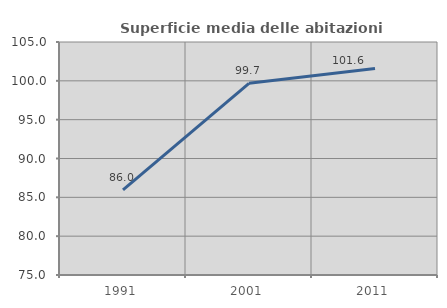
| Category | Superficie media delle abitazioni occupate |
|---|---|
| 1991.0 | 85.951 |
| 2001.0 | 99.682 |
| 2011.0 | 101.578 |